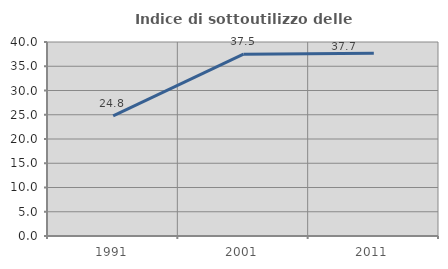
| Category | Indice di sottoutilizzo delle abitazioni  |
|---|---|
| 1991.0 | 24.779 |
| 2001.0 | 37.481 |
| 2011.0 | 37.658 |